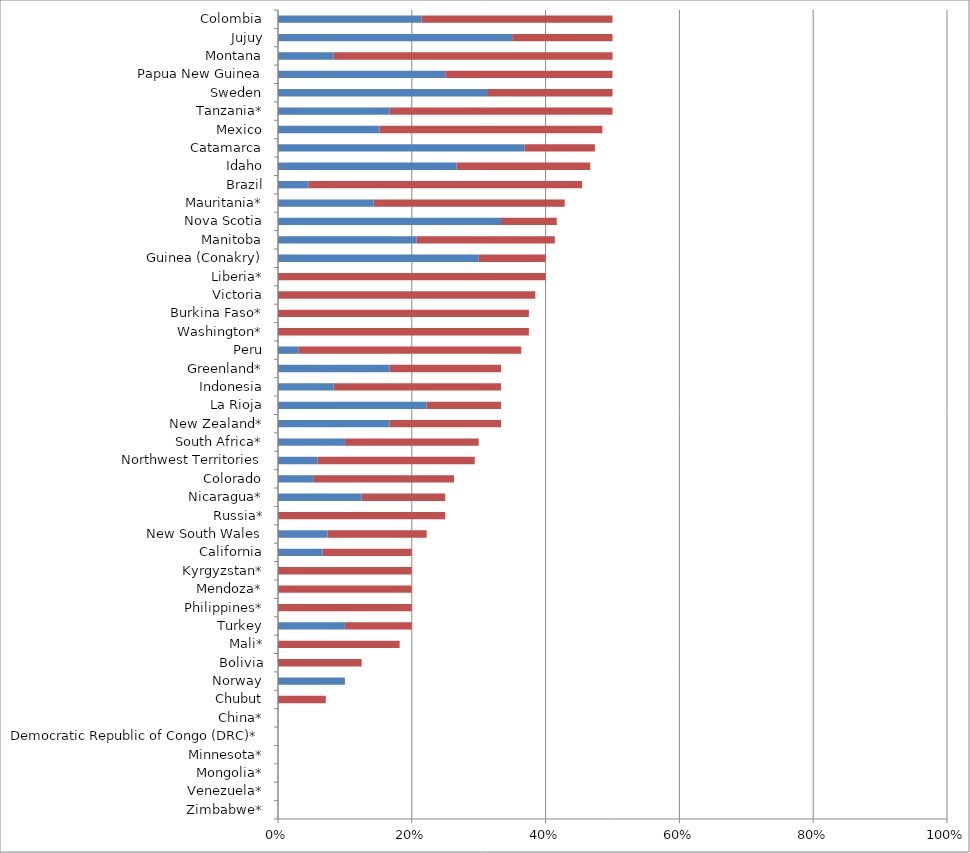
| Category | Series 0 | Series 1 |
|---|---|---|
| Zimbabwe* | 0 | 0 |
| Venezuela* | 0 | 0 |
| Mongolia* | 0 | 0 |
| Minnesota* | 0 | 0 |
| Democratic Republic of Congo (DRC)* | 0 | 0 |
| China* | 0 | 0 |
| Chubut | 0 | 0.071 |
| Norway | 0.1 | 0 |
| Bolivia | 0 | 0.125 |
| Mali* | 0 | 0.182 |
| Turkey | 0.1 | 0.1 |
| Philippines* | 0 | 0.2 |
| Mendoza* | 0 | 0.2 |
| Kyrgyzstan* | 0 | 0.2 |
| California | 0.067 | 0.133 |
| New South Wales | 0.074 | 0.148 |
| Russia* | 0 | 0.25 |
| Nicaragua* | 0.125 | 0.125 |
| Colorado | 0.053 | 0.211 |
| Northwest Territories | 0.059 | 0.235 |
| South Africa* | 0.1 | 0.2 |
| New Zealand* | 0.167 | 0.167 |
| La Rioja | 0.222 | 0.111 |
| Indonesia | 0.083 | 0.25 |
| Greenland* | 0.167 | 0.167 |
| Peru | 0.03 | 0.333 |
| Washington* | 0 | 0.375 |
| Burkina Faso* | 0 | 0.375 |
| Victoria | 0 | 0.385 |
| Liberia* | 0 | 0.4 |
| Guinea (Conakry) | 0.3 | 0.1 |
| Manitoba | 0.207 | 0.207 |
| Nova Scotia | 0.333 | 0.083 |
| Mauritania* | 0.143 | 0.286 |
| Brazil | 0.045 | 0.409 |
| Idaho | 0.267 | 0.2 |
| Catamarca | 0.368 | 0.105 |
| Mexico | 0.152 | 0.333 |
| Tanzania* | 0.167 | 0.333 |
| Sweden | 0.312 | 0.188 |
| Papua New Guinea | 0.25 | 0.25 |
| Montana | 0.083 | 0.417 |
| Jujuy | 0.35 | 0.15 |
| Colombia | 0.214 | 0.286 |